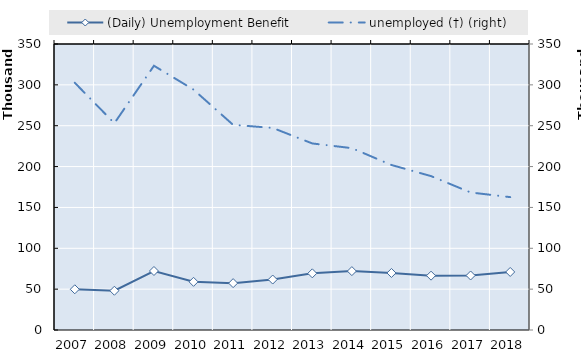
| Category | Series 4 | Series 5 | Series 6 | Series 7 | Series 8 | Series 9 | Series 10 | Series 11 | Series 12 | Series 13 | Series 14 | Series 15 | Series 16 | Series 17 | Series 18 | Series 19 | (Daily) Unemployment Benefit |
|---|---|---|---|---|---|---|---|---|---|---|---|---|---|---|---|---|---|
| 2007.0 |  |  |  |  |  |  |  |  |  |  |  |  |  |  |  |  | 49817 |
| 2008.0 |  |  |  |  |  |  |  |  |  |  |  |  |  |  |  |  | 48045 |
| 2009.0 |  |  |  |  |  |  |  |  |  |  |  |  |  |  |  |  | 72203 |
| 2010.0 |  |  |  |  |  |  |  |  |  |  |  |  |  |  |  |  | 58950 |
| 2011.0 |  |  |  |  |  |  |  |  |  |  |  |  |  |  |  |  | 57354 |
| 2012.0 |  |  |  |  |  |  |  |  |  |  |  |  |  |  |  |  | 61759 |
| 2013.0 |  |  |  |  |  |  |  |  |  |  |  |  |  |  |  |  | 69351 |
| 2014.0 |  |  |  |  |  |  |  |  |  |  |  |  |  |  |  |  | 72054 |
| 2015.0 |  |  |  |  |  |  |  |  |  |  |  |  |  |  |  |  | 69780 |
| 2016.0 |  |  |  |  |  |  |  |  |  |  |  |  |  |  |  |  | 66500 |
| 2017.0 |  |  |  |  |  |  |  |  |  |  |  |  |  |  |  |  | 66701 |
| 2018.0 |  |  |  |  |  |  |  |  |  |  |  |  |  |  |  |  | 71032 |